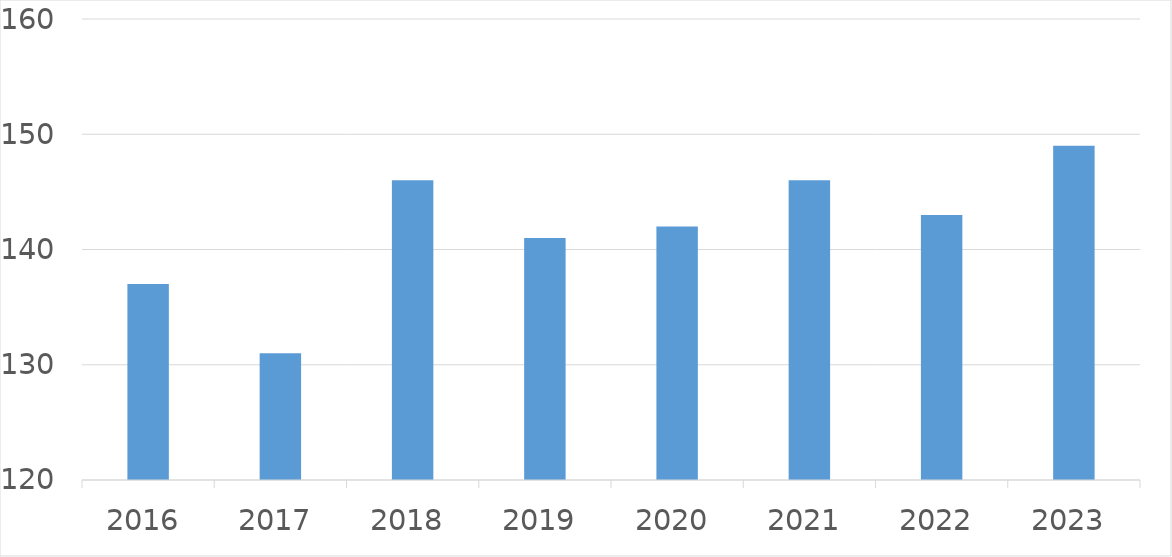
| Category | Series 0 |
|---|---|
| 2016 | 137 |
| 2017 | 131 |
| 2018 | 146 |
| 2019 | 141 |
| 2020 | 142 |
| 2021 | 146 |
| 2022 | 143 |
| 2023 | 149 |